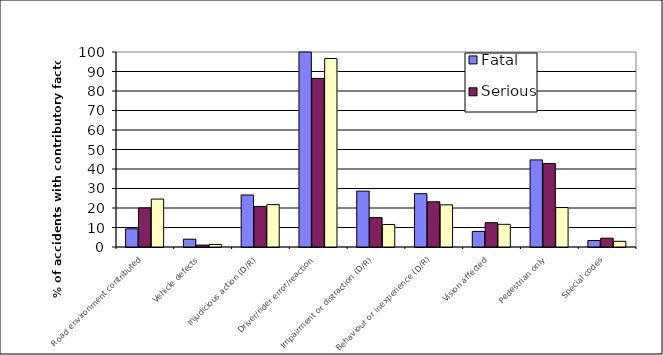
| Category | Fatal | Serious | Slight |
|---|---|---|---|
| Road environment contributed | 9.333 | 20.046 | 24.577 |
| Vehicle defects | 4 | 0.995 | 1.287 |
| Injudicious action (D/R) | 26.667 | 20.811 | 21.738 |
| Driver/rider error/reaction | 102.667 | 86.458 | 96.668 |
| Impairment or distraction (D/R) | 28.667 | 15.073 | 11.548 |
| Behaviour or inexperience (D/R) | 27.333 | 23.183 | 21.633 |
| Vision affected | 8 | 12.471 | 11.636 |
| Pedestrian only | 44.667 | 42.846 | 20.24 |
| Special codes | 3.333 | 4.514 | 2.909 |